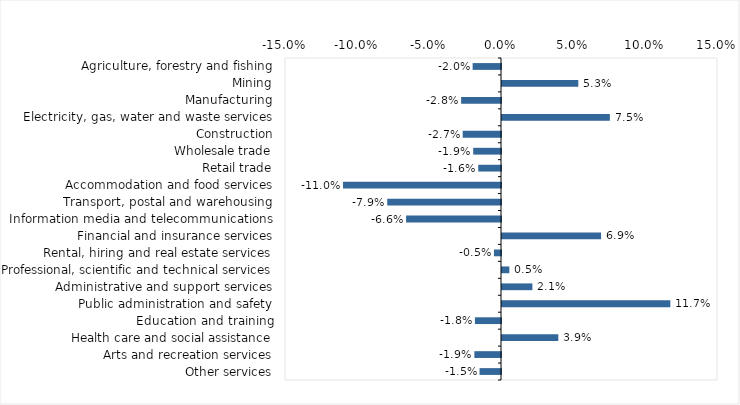
| Category | This week |
|---|---|
| Agriculture, forestry and fishing | -0.02 |
| Mining | 0.053 |
| Manufacturing | -0.028 |
| Electricity, gas, water and waste services | 0.075 |
| Construction | -0.027 |
| Wholesale trade | -0.019 |
| Retail trade | -0.016 |
| Accommodation and food services | -0.11 |
| Transport, postal and warehousing | -0.079 |
| Information media and telecommunications | -0.066 |
| Financial and insurance services | 0.069 |
| Rental, hiring and real estate services | -0.005 |
| Professional, scientific and technical services | 0.005 |
| Administrative and support services | 0.021 |
| Public administration and safety | 0.117 |
| Education and training | -0.018 |
| Health care and social assistance | 0.039 |
| Arts and recreation services | -0.018 |
| Other services | -0.015 |